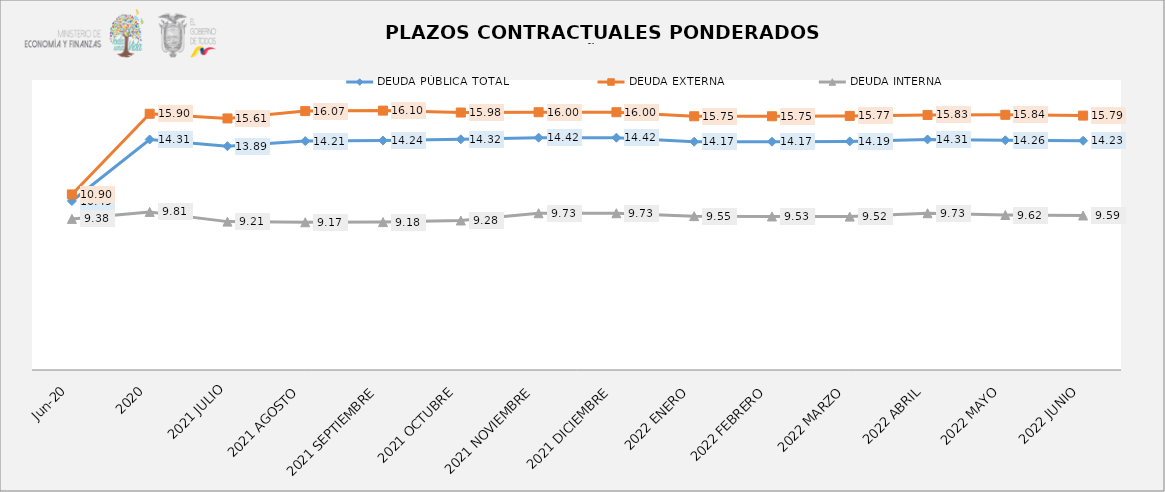
| Category | DEUDA PÚBLICA TOTAL | DEUDA EXTERNA  | DEUDA INTERNA |
|---|---|---|---|
| jun-20 | 10.488 | 10.898 | 9.379 |
| 2020 | 14.309 | 15.905 | 9.812 |
| 2021 JULIO | 13.89 | 15.614 | 9.21 |
| 2021 AGOSTO | 14.21 | 16.07 | 9.17 |
| 2021 SEPTIEMBRE | 14.24 | 16.1 | 9.18 |
| 2021 OCTUBRE | 14.32 | 15.98 | 9.28 |
| 2021 NOVIEMBRE | 14.42 | 16 | 9.73 |
| 2021 DICIEMBRE | 14.42 | 16 | 9.73 |
| 2022 ENERO | 14.17 | 15.75 | 9.55 |
| 2022 FEBRERO | 14.17 | 15.75 | 9.53 |
| 2022 MARZO | 14.19 | 15.77 | 9.52 |
| 2022 ABRIL | 14.31 | 15.83 | 9.73 |
| 2022 MAYO | 14.26 | 15.84 | 9.62 |
| 2022 JUNIO | 14.23 | 15.79 | 9.59 |